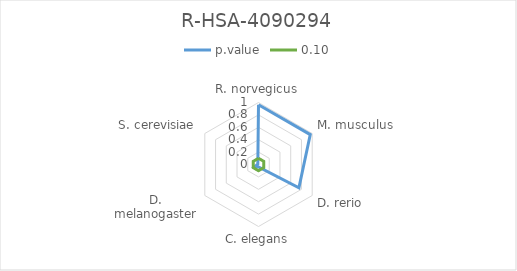
| Category | p.value | 0.10 |
|---|---|---|
| R. norvegicus | 0.964 | 0.1 |
| M. musculus | 0.964 | 0.1 |
| D. rerio | 0.753 | 0.1 |
| C. elegans | 0.038 | 0.1 |
| D. melanogaster | 0.068 | 0.1 |
| S. cerevisiae | 0.013 | 0.1 |